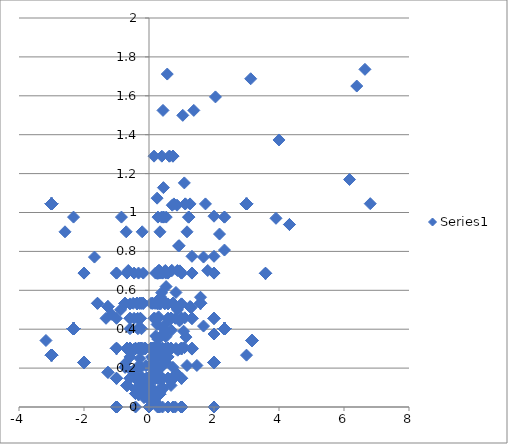
| Category | Series 0 |
|---|---|
| 6.807354922057604 | 1.045 |
| 6.643856189774725 | 1.736 |
| 6.39231742277876 | 1.65 |
| 6.169925001442312 | 1.17 |
| 4.321928094887363 | 0.938 |
| 4.321928094887363 | 0.938 |
| 4.0 | 1.373 |
| 3.9068905956085187 | 0.97 |
| 3.5849625007211565 | 0.687 |
| 3.5849625007211565 | 0.687 |
| 3.5849625007211565 | 0.687 |
| 3.5849625007211565 | 0.687 |
| 3.1699250014423126 | 0.342 |
| 3.1699250014423126 | 0.342 |
| 3.1699250014423126 | 0.342 |
| 3.1699250014423126 | 0.342 |
| 3.1699250014423126 | 0.342 |
| 3.129283016944967 | 1.688 |
| 3.0 | 0.267 |
| 3.0 | 1.044 |
| 3.0 | 1.044 |
| 3.0 | 1.044 |
| 3.0 | 1.044 |
| 3.0 | 1.044 |
| 3.0 | 1.044 |
| 3.0 | 1.044 |
| 3.0 | 1.044 |
| 3.0 | 1.044 |
| 3.0 | 1.044 |
| 3.0 | 1.044 |
| 3.0 | 1.044 |
| 3.0 | 1.044 |
| 2.321928094887362 | 0.402 |
| 2.321928094887362 | 0.402 |
| 2.321928094887362 | 0.402 |
| 2.321928094887362 | 0.402 |
| 2.321928094887362 | 0.402 |
| 2.321928094887362 | 0.402 |
| 2.321928094887362 | 0.402 |
| 2.321928094887362 | 0.402 |
| 2.321928094887362 | 0.402 |
| 2.321928094887362 | 0.402 |
| 2.321928094887362 | 0.402 |
| 2.321928094887362 | 0.402 |
| 2.321928094887362 | 0.402 |
| 2.321928094887362 | 0.402 |
| 2.321928094887362 | 0.402 |
| 2.321928094887362 | 0.402 |
| 2.321928094887362 | 0.402 |
| 2.321928094887362 | 0.402 |
| 2.321928094887362 | 0.402 |
| 2.321928094887362 | 0.402 |
| 2.321928094887362 | 0.402 |
| 2.321928094887362 | 0.402 |
| 2.321928094887362 | 0.402 |
| 2.321928094887362 | 0.402 |
| 2.321928094887362 | 0.402 |
| 2.321928094887362 | 0.402 |
| 2.321928094887362 | 0.402 |
| 2.321928094887362 | 0.402 |
| 2.321928094887362 | 0.402 |
| 2.321928094887362 | 0.402 |
| 2.321928094887362 | 0.402 |
| 2.321928094887362 | 0.402 |
| 2.321928094887362 | 0.402 |
| 2.321928094887362 | 0.402 |
| 2.321928094887362 | 0.402 |
| 2.321928094887362 | 0.402 |
| 2.321928094887362 | 0.402 |
| 2.321928094887362 | 0.402 |
| 2.321928094887362 | 0.402 |
| 2.321928094887362 | 0.402 |
| 2.321928094887362 | 0.402 |
| 2.321928094887362 | 0.402 |
| 2.321928094887362 | 0.402 |
| 2.321928094887362 | 0.402 |
| 2.321928094887362 | 0.402 |
| 2.321928094887362 | 0.402 |
| 2.321928094887362 | 0.402 |
| 2.321928094887362 | 0.402 |
| 2.321928094887362 | 0.402 |
| 2.321928094887362 | 0.402 |
| 2.321928094887362 | 0.402 |
| 2.321928094887362 | 0.402 |
| 2.321928094887362 | 0.402 |
| 2.321928094887362 | 0.402 |
| 2.321928094887362 | 0.807 |
| 2.321928094887362 | 0.976 |
| 2.321928094887362 | 0.976 |
| 2.1699250014423126 | 0.889 |
| 2.0443941193584534 | 1.594 |
| 2.0 | 0.23 |
| 2.0 | 0.23 |
| 2.0 | 0.23 |
| 2.0 | 0.23 |
| 2.0 | 0.23 |
| 2.0 | 0.23 |
| 2.0 | 0.23 |
| 2.0 | 0.23 |
| 2.0 | 0.23 |
| 2.0 | 0.23 |
| 2.0 | 0.23 |
| 2.0 | 0.23 |
| 2.0 | 0.23 |
| 2.0 | 0.23 |
| 2.0 | 0.23 |
| 2.0 | 0.23 |
| 2.0 | 0.23 |
| 2.0 | 0.23 |
| 2.0 | 0.23 |
| 2.0 | 0.23 |
| 2.0 | 0.23 |
| 2.0 | 0.23 |
| 2.0 | 0.23 |
| 2.0 | 0.23 |
| 2.0 | 0.23 |
| 2.0 | 0.23 |
| 2.0 | 0.23 |
| 2.0 | 0.23 |
| 2.0 | 0.23 |
| 2.0 | 0.23 |
| 2.0 | 0.23 |
| 2.0 | 0.23 |
| 2.0 | 0.23 |
| 2.0 | 0.23 |
| 2.0 | 0.23 |
| 2.0 | 0.23 |
| 2.0 | 0.23 |
| 2.0 | 0.23 |
| 2.0 | 0.23 |
| 2.0 | 0.23 |
| 2.0 | 0.23 |
| 2.0 | 0.23 |
| 2.0 | 0.23 |
| 2.0 | 0.23 |
| 2.0 | 0.23 |
| 2.0 | 0.23 |
| 2.0 | 0.23 |
| 2.0 | 0.23 |
| 2.0 | 0.23 |
| 2.0 | 0.23 |
| 2.0 | 0.23 |
| 2.0 | 0.23 |
| 2.0 | 0.23 |
| 2.0 | 0.23 |
| 2.0 | 0.23 |
| 2.0 | 0.23 |
| 2.0 | 0.23 |
| 2.0 | 0.375 |
| 2.0 | 0.456 |
| 2.0 | 0.456 |
| 2.0 | 0.456 |
| 2.0 | 0.456 |
| 2.0 | 0.689 |
| 2.0 | 0.689 |
| 2.0 | 0.775 |
| 2.0 | 0.981 |
| 2.0 | 0 |
| 1.8073549220576042 | 0.702 |
| 1.7369655941662063 | 1.044 |
| 1.6780719051126378 | 0.416 |
| 1.6780719051126378 | 0.771 |
| 1.5849625007211563 | 0.533 |
| 1.5849625007211563 | 0.533 |
| 1.5849625007211563 | 0.533 |
| 1.5849625007211563 | 0.533 |
| 1.5849625007211563 | 0.533 |
| 1.5849625007211563 | 0.533 |
| 1.5849625007211563 | 0.564 |
| 1.4739311883324122 | 0.214 |
| 1.3785116232537298 | 1.525 |
| 1.3219280948873624 | 0.298 |
| 1.3219280948873624 | 0.301 |
| 1.3219280948873624 | 0.301 |
| 1.3219280948873624 | 0.301 |
| 1.3219280948873624 | 0.456 |
| 1.3219280948873624 | 0.456 |
| 1.3219280948873624 | 0.456 |
| 1.3219280948873624 | 0.456 |
| 1.3219280948873624 | 0.689 |
| 1.3219280948873624 | 0.689 |
| 1.3219280948873624 | 0.775 |
| 1.299560281858908 | 0.511 |
| 1.2630344058337937 | 0.515 |
| 1.2630344058337937 | 0.515 |
| 1.2630344058337937 | 0.515 |
| 1.2630344058337937 | 1.044 |
| 1.222392421336448 | 0.976 |
| 1.222392421336448 | 0.976 |
| 1.222392421336448 | 0.976 |
| 1.1699250014423124 | 0.213 |
| 1.1699250014423124 | 0.901 |
| 1.1375035237499351 | 0.359 |
| 1.1154772174199359 | 1.044 |
| 1.1154772174199359 | 1.044 |
| 1.0995356735509143 | 0.459 |
| 1.0874628412503395 | 0.305 |
| 1.0874628412503395 | 1.152 |
| 1.0641303374197155 | 0.39 |
| 1.0395283641866373 | 1.5 |
| 1.0 | 0.148 |
| 1.0 | 0.148 |
| 1.0 | 0.148 |
| 1.0 | 0.301 |
| 1.0 | 0.301 |
| 1.0 | 0.301 |
| 1.0 | 0.301 |
| 1.0 | 0.301 |
| 1.0 | 0.301 |
| 1.0 | 0.301 |
| 1.0 | 0.301 |
| 1.0 | 0.301 |
| 1.0 | 0.301 |
| 1.0 | 0.301 |
| 1.0 | 0.301 |
| 1.0 | 0.301 |
| 1.0 | 0.301 |
| 1.0 | 0.301 |
| 1.0 | 0.301 |
| 1.0 | 0.301 |
| 1.0 | 0.301 |
| 1.0 | 0.301 |
| 1.0 | 0.301 |
| 1.0 | 0.301 |
| 1.0 | 0.301 |
| 1.0 | 0.301 |
| 1.0 | 0.301 |
| 1.0 | 0.301 |
| 1.0 | 0.301 |
| 1.0 | 0.301 |
| 1.0 | 0.301 |
| 1.0 | 0.301 |
| 1.0 | 0.301 |
| 1.0 | 0.301 |
| 1.0 | 0.301 |
| 1.0 | 0.301 |
| 1.0 | 0.301 |
| 1.0 | 0.301 |
| 1.0 | 0.301 |
| 1.0 | 0.301 |
| 1.0 | 0.301 |
| 1.0 | 0.301 |
| 1.0 | 0.301 |
| 1.0 | 0.301 |
| 1.0 | 0.301 |
| 1.0 | 0.301 |
| 1.0 | 0.301 |
| 1.0 | 0.301 |
| 1.0 | 0.456 |
| 1.0 | 0.456 |
| 1.0 | 0.456 |
| 1.0 | 0.456 |
| 1.0 | 0.53 |
| 1.0 | 0.53 |
| 1.0 | 0.689 |
| 1.0 | 0.689 |
| 1.0 | 0 |
| 1.0 | 0 |
| 1.0 | 0 |
| 1.0 | 0 |
| 1.0 | 0 |
| 1.0 | 0 |
| 1.0 | 0 |
| 0.9475325801058645 | 0.7 |
| 0.9385994553358568 | 0.443 |
| 0.925999418556223 | 0.83 |
| 0.9125371587496607 | 0.828 |
| 0.8845227825800641 | 0.292 |
| 0.874469117916141 | 0.5 |
| 0.874469117916141 | 0.702 |
| 0.8624964762500651 | 1.038 |
| 0.8479969065549501 | 0.172 |
| 0.8479969065549501 | 0.172 |
| 0.8300749985576876 | 0.301 |
| 0.8300749985576876 | 0.589 |
| 0.8073549220576041 | 0.456 |
| 0.8073549220576041 | 0 |
| 0.765534746362977 | 1.044 |
| 0.7369655941662062 | 0.204 |
| 0.7369655941662062 | 0.53 |
| 0.7369655941662062 | 0.533 |
| 0.7369655941662062 | 0.533 |
| 0.7369655941662062 | 0.533 |
| 0.7369655941662062 | 0.533 |
| 0.7369655941662062 | 0.533 |
| 0.7369655941662062 | 0.533 |
| 0.7369655941662062 | 0.533 |
| 0.7369655941662062 | 0.533 |
| 0.7369655941662062 | 0.533 |
| 0.7369655941662062 | 1.29 |
| 0.7369655941662062 | 1.29 |
| 0.7369655941662062 | 0 |
| 0.7162070339994088 | 1.038 |
| 0.7004397181410922 | 0.138 |
| 0.7004397181410922 | 0.702 |
| 0.7004397181410922 | 0.702 |
| 0.6896598793878495 | 0.394 |
| 0.6780719051126378 | 0.111 |
| 0.6780719051126378 | 0.301 |
| 0.6780719051126378 | 0.301 |
| 0.6780719051126378 | 0.301 |
| 0.6780719051126378 | 0.301 |
| 0.6780719051126378 | 0.301 |
| 0.6780719051126378 | 0.301 |
| 0.6780719051126378 | 0.301 |
| 0.6780719051126378 | 0.301 |
| 0.6780719051126378 | 0.301 |
| 0.6780719051126378 | 0.301 |
| 0.6780719051126378 | 0.301 |
| 0.6780719051126378 | 0.301 |
| 0.6780719051126378 | 0.301 |
| 0.6780719051126378 | 0.301 |
| 0.6780719051126378 | 0.301 |
| 0.6780719051126378 | 0.301 |
| 0.6780719051126378 | 0.301 |
| 0.6780719051126378 | 0.301 |
| 0.6780719051126378 | 0.301 |
| 0.6780719051126378 | 0.301 |
| 0.6780719051126378 | 0.301 |
| 0.6780719051126378 | 0.301 |
| 0.6780719051126378 | 0.301 |
| 0.6780719051126378 | 0.301 |
| 0.6780719051126378 | 0.456 |
| 0.6780719051126378 | 0.456 |
| 0.6780719051126378 | 0.456 |
| 0.6780719051126378 | 0.456 |
| 0.6280312226130421 | 1.29 |
| 0.6280312226130421 | 1.29 |
| 0.5849625007211562 | 0.148 |
| 0.5849625007211562 | 0.148 |
| 0.5849625007211562 | 0.148 |
| 0.5849625007211562 | 0.257 |
| 0.5849625007211562 | 0.257 |
| 0.5849625007211562 | 0.301 |
| 0.5849625007211562 | 0.301 |
| 0.5849625007211562 | 0.301 |
| 0.5849625007211562 | 0.301 |
| 0.5849625007211562 | 0.301 |
| 0.5849625007211562 | 0.301 |
| 0.5849625007211562 | 0.301 |
| 0.5849625007211562 | 0.301 |
| 0.5849625007211562 | 0.301 |
| 0.5849625007211562 | 0.301 |
| 0.5849625007211562 | 0.301 |
| 0.5849625007211562 | 0.301 |
| 0.5849625007211562 | 0.301 |
| 0.5849625007211562 | 0.301 |
| 0.5849625007211562 | 0.301 |
| 0.5849625007211562 | 0.301 |
| 0.5849625007211562 | 0.301 |
| 0.5849625007211562 | 0.301 |
| 0.5849625007211562 | 0.301 |
| 0.5849625007211562 | 0.301 |
| 0.5849625007211562 | 0.301 |
| 0.5849625007211562 | 0.301 |
| 0.5849625007211562 | 0.301 |
| 0.5849625007211562 | 0.301 |
| 0.5849625007211562 | 0.301 |
| 0.5849625007211562 | 0.301 |
| 0.5849625007211562 | 0.301 |
| 0.5849625007211562 | 0.301 |
| 0.5849625007211562 | 0.301 |
| 0.5849625007211562 | 0.301 |
| 0.5849625007211562 | 0.301 |
| 0.5849625007211562 | 0.301 |
| 0.5849625007211562 | 0.456 |
| 0.5849625007211562 | 0.456 |
| 0.5849625007211562 | 0.53 |
| 0.5849625007211562 | 0.689 |
| 0.5849625007211562 | 0.689 |
| 0.5849625007211562 | 0 |
| 0.5849625007211562 | 0 |
| 0.5849625007211562 | 0 |
| 0.5849625007211562 | 0 |
| 0.5849625007211562 | 0 |
| 0.561878887608115 | 1.712 |
| 0.5305147166987798 | 0.976 |
| 0.5260688116675877 | 0.619 |
| 0.5193741590935794 | 0.361 |
| 0.5145731728297582 | 0.23 |
| 0.5145731728297582 | 0.298 |
| 0.5145731728297582 | 0.298 |
| 0.5145731728297582 | 0.301 |
| 0.5145731728297582 | 0.689 |
| 0.5025003405291834 | 0.702 |
| 0.49749965947081687 | 0.424 |
| 0.4854268271702417 | 0.533 |
| 0.4854268271702417 | 0.533 |
| 0.4854268271702417 | 0.533 |
| 0.4854268271702417 | 0.533 |
| 0.4854268271702417 | 0.533 |
| 0.4854268271702417 | 0.533 |
| 0.4854268271702417 | 0.533 |
| 0.46566357234881184 | 0.695 |
| 0.45943161863729726 | 0.298 |
| 0.44745897697122117 | 0.245 |
| 0.44745897697122117 | 0.402 |
| 0.44745897697122117 | 0.976 |
| 0.44745897697122117 | 0.976 |
| 0.44294349584872833 | 1.128 |
| 0.4405725913859815 | 0.375 |
| 0.4405725913859815 | 0.375 |
| 0.43063435432986236 | 1.525 |
| 0.4150374992788437 | 0.091 |
| 0.4150374992788437 | 0.1 |
| 0.4150374992788437 | 0.1 |
| 0.4150374992788437 | 0.1 |
| 0.4150374992788437 | 0.1 |
| 0.4150374992788437 | 0.148 |
| 0.4150374992788437 | 0.148 |
| 0.4150374992788437 | 0.148 |
| 0.4150374992788437 | 0.257 |
| 0.4150374992788437 | 0.257 |
| 0.4150374992788437 | 0.301 |
| 0.4150374992788437 | 0.301 |
| 0.4150374992788437 | 0.301 |
| 0.4150374992788437 | 0.301 |
| 0.4150374992788437 | 0.301 |
| 0.4150374992788437 | 0.301 |
| 0.4150374992788437 | 0.301 |
| 0.4150374992788437 | 0.301 |
| 0.4150374992788437 | 0.301 |
| 0.4150374992788437 | 0.301 |
| 0.4150374992788437 | 0.301 |
| 0.4150374992788437 | 0.301 |
| 0.4150374992788437 | 0.301 |
| 0.4150374992788437 | 0.301 |
| 0.4150374992788437 | 0.301 |
| 0.4150374992788437 | 0.689 |
| 0.4150374992788437 | 0.689 |
| 0.4150374992788437 | 0 |
| 0.3959286763311393 | 1.29 |
| 0.3870231231092473 | 0.587 |
| 0.3870231231092473 | 0.976 |
| 0.3625700793847084 | 0.204 |
| 0.3625700793847084 | 0.204 |
| 0.3625700793847084 | 0.204 |
| 0.3625700793847084 | 0.204 |
| 0.3625700793847084 | 0.204 |
| 0.3625700793847084 | 0.204 |
| 0.3625700793847084 | 0.204 |
| 0.3625700793847084 | 0.204 |
| 0.3625700793847084 | 0.204 |
| 0.3625700793847084 | 0.204 |
| 0.3625700793847084 | 0.204 |
| 0.3625700793847084 | 0.204 |
| 0.3625700793847084 | 0.204 |
| 0.3625700793847084 | 0.533 |
| 0.3625700793847084 | 0.533 |
| 0.3625700793847084 | 0.533 |
| 0.3625700793847084 | 0.533 |
| 0.3625700793847084 | 0.564 |
| 0.3479233034203068 | 0.689 |
| 0.33703498727757064 | 0.901 |
| 0.32192809488736235 | 0.065 |
| 0.32192809488736235 | 0.065 |
| 0.32192809488736235 | 0.065 |
| 0.32192809488736235 | 0.065 |
| 0.32192809488736235 | 0.065 |
| 0.32192809488736235 | 0.065 |
| 0.32192809488736235 | 0.065 |
| 0.32192809488736235 | 0.065 |
| 0.32192809488736235 | 0.065 |
| 0.32192809488736235 | 0.065 |
| 0.32192809488736235 | 0.065 |
| 0.32192809488736235 | 0.065 |
| 0.32192809488736235 | 0.065 |
| 0.32192809488736235 | 0.065 |
| 0.32192809488736235 | 0.065 |
| 0.32192809488736235 | 0.065 |
| 0.32192809488736235 | 0.065 |
| 0.32192809488736235 | 0.073 |
| 0.32192809488736235 | 0.073 |
| 0.32192809488736235 | 0.073 |
| 0.32192809488736235 | 0.091 |
| 0.32192809488736235 | 0.148 |
| 0.32192809488736235 | 0.148 |
| 0.32192809488736235 | 0.301 |
| 0.32192809488736235 | 0.301 |
| 0.32192809488736235 | 0.301 |
| 0.32192809488736235 | 0.301 |
| 0.32192809488736235 | 0.301 |
| 0.32192809488736235 | 0.301 |
| 0.32192809488736235 | 0.301 |
| 0.32192809488736235 | 0.301 |
| 0.32192809488736235 | 0.53 |
| 0.32192809488736235 | 0.702 |
| 0.32192809488736235 | 0 |
| 0.32192809488736235 | 0 |
| 0.30485458152842093 | 0.351 |
| 0.30485458152842093 | 0.692 |
| 0.29956028185890793 | 0.689 |
| 0.2954558835261713 | 0.463 |
| 0.2954558835261713 | 0.702 |
| 0.28950661719498505 | 0.204 |
| 0.28950661719498505 | 0.204 |
| 0.28950661719498505 | 0.204 |
| 0.28950661719498505 | 0.204 |
| 0.28950661719498505 | 0 |
| 0.2801079191927352 | 0.456 |
| 0.27563444261342734 | 0.976 |
| 0.2700891633677442 | 0.349 |
| 0.2630344058337938 | 0.148 |
| 0.2630344058337938 | 0.148 |
| 0.2630344058337938 | 0.257 |
| 0.2630344058337938 | 0.257 |
| 0.2630344058337938 | 0.257 |
| 0.2630344058337938 | 0.257 |
| 0.2630344058337938 | 0.257 |
| 0.2630344058337938 | 0.257 |
| 0.2630344058337938 | 0.257 |
| 0.2630344058337938 | 0.301 |
| 0.2630344058337938 | 0.301 |
| 0.2630344058337938 | 0.301 |
| 0.2630344058337938 | 0.301 |
| 0.2630344058337938 | 0.301 |
| 0.2630344058337938 | 0.301 |
| 0.2630344058337938 | 0.301 |
| 0.2630344058337938 | 0.53 |
| 0.2630344058337938 | 0.689 |
| 0.2630344058337938 | 0.689 |
| 0.2630344058337938 | 0.689 |
| 0.2630344058337938 | 0.689 |
| 0.2630344058337938 | 0.689 |
| 0.2630344058337938 | 0.689 |
| 0.2630344058337938 | 0.689 |
| 0.2630344058337938 | 0.689 |
| 0.2630344058337938 | 0.689 |
| 0.2630344058337938 | 0.689 |
| 0.2630344058337938 | 0 |
| 0.24997825300834758 | 0.424 |
| 0.2490275478399146 | 1.074 |
| 0.24100809950379498 | 0.204 |
| 0.22239242133644802 | 0.152 |
| 0.22239242133644802 | 0.301 |
| 0.22239242133644802 | 0.301 |
| 0.22239242133644802 | 0.301 |
| 0.22239242133644802 | 0.301 |
| 0.22239242133644802 | 0.301 |
| 0.22239242133644802 | 0.301 |
| 0.20645087746742624 | 0.365 |
| 0.20645087746742624 | 0.533 |
| 0.20163386116965043 | 0.689 |
| 0.19264507794239583 | 0.058 |
| 0.19264507794239583 | 0.148 |
| 0.19264507794239583 | 0.148 |
| 0.19264507794239583 | 0.148 |
| 0.19264507794239583 | 0.148 |
| 0.19264507794239583 | 0.152 |
| 0.19264507794239583 | 0.183 |
| 0.19264507794239583 | 0.298 |
| 0.19264507794239583 | 0.301 |
| 0.19264507794239583 | 0.301 |
| 0.19264507794239583 | 0.301 |
| 0.19264507794239583 | 0.301 |
| 0.18057224564182084 | 0.204 |
| 0.17687776208407918 | 0.456 |
| 0.17333160288556176 | 0.533 |
| 0.16992500144231237 | 0.03 |
| 0.16992500144231237 | 0.03 |
| 0.16992500144231237 | 0.03 |
| 0.16992500144231237 | 0.257 |
| 0.16992500144231237 | 0.301 |
| 0.16992500144231237 | 0.301 |
| 0.15472259479864203 | 1.29 |
| 0.15200309344505006 | 0.148 |
| 0.15200309344505006 | 0.148 |
| 0.15200309344505006 | 0.301 |
| 0.15200309344505006 | 0.301 |
| 0.15200309344505006 | 0.456 |
| 0.13750352374993502 | 0.204 |
| 0.13750352374993502 | 0.301 |
| 0.13430109171159113 | 0.245 |
| 0.12553088208385882 | 0.301 |
| 0.12553088208385882 | 0.301 |
| 0.12553088208385882 | 0.301 |
| 0.12553088208385882 | 0.301 |
| 0.12199052437861024 | 0.23 |
| 0.11547721741993588 | 0.23 |
| 0.11547721741993588 | 0.257 |
| 0.11547721741993588 | 0.301 |
| 0.11103131238874395 | 0.165 |
| 0.11103131238874395 | 0.533 |
| 0.1069152039165119 | 0.148 |
| 0.1069152039165119 | 0.301 |
| 0.1069152039165119 | 0.533 |
| 0.09310940439148147 | 0.148 |
| 0.0874628412503394 | 0.301 |
| 0.08246216019197297 | 0.098 |
| 0.08246216019197297 | 0.257 |
| 0.08246216019197297 | 0.301 |
| 0.07800251200127317 | 0.204 |
| 0.07214978575583542 | 0.165 |
| 0.06871275008401431 | 0.065 |
| 0.06273575534796275 | 0.533 |
| 0.05444778402237651 | 0.301 |
| 0.05246741989413548 | 0.301 |
| 0.05246741989413548 | 0.301 |
| 0.05062607306996814 | 0.301 |
| 0.04730571477835682 | 0.148 |
| 0.04580368961312475 | 0.1 |
| 0.033947331923337536 | 0.048 |
| 0.014950341465971606 | 0.05 |
| 0.0 | 0 |
| 0.0 | 0 |
| 0.0 | 0 |
| 0.0 | 0 |
| 0.0 | 0 |
| 0.0 | 0 |
| 0.0 | 0 |
| 0.0 | 0 |
| 0.0 | 0 |
| 0.0 | 0 |
| 0.0 | 0 |
| 0.0 | 0 |
| 0.0 | 0 |
| 0.0 | 0 |
| 0.0 | 0 |
| 0.0 | 0 |
| 0.0 | 0 |
| 0.0 | 0 |
| 0.0 | 0 |
| 0.0 | 0 |
| 0.0 | 0 |
| 0.0 | 0 |
| 0.0 | 0 |
| 0.0 | 0 |
| 0.0 | 0 |
| 0.0 | 0 |
| 0.0 | 0 |
| 0.0 | 0 |
| 0.0 | 0 |
| 0.0 | 0 |
| 0.0 | 0 |
| 0.0 | 0 |
| 0.0 | 0 |
| 0.0 | 0 |
| 0.0 | 0 |
| 0.0 | 0 |
| 0.0 | 0 |
| 0.0 | 0 |
| 0.0 | 0 |
| 0.0 | 0 |
| 0.0 | 0 |
| 0.0 | 0 |
| 0.0 | 0 |
| 0.0 | 0 |
| 0.0 | 0 |
| 0.0 | 0 |
| 0.0 | 0 |
| 0.0 | 0 |
| 0.0 | 0 |
| 0.0 | 0 |
| 0.0 | 0 |
| 0.0 | 0 |
| 0.0 | 0 |
| 0.0 | 0 |
| 0.0 | 0 |
| 0.0 | 0 |
| 0.0 | 0 |
| 0.0 | 0 |
| 0.0 | 0 |
| 0.0 | 0 |
| 0.0 | 0 |
| 0.0 | 0 |
| 0.0 | 0 |
| 0.0 | 0 |
| 0.0 | 0 |
| 0.0 | 0 |
| 0.0 | 0 |
| 0.0 | 0 |
| 0.0 | 0 |
| 0.0 | 0 |
| 0.0 | 0 |
| 0.0 | 0 |
| 0.0 | 0 |
| 0.0 | 0 |
| 0.0 | 0 |
| 0.0 | 0 |
| 0.0 | 0 |
| 0.0 | 0 |
| 0.0 | 0 |
| 0.0 | 0 |
| 0.0 | 0 |
| 0.0 | 0 |
| 0.0 | 0 |
| 0.0 | 0 |
| 0.0 | 0 |
| 0.0 | 0 |
| 0.0 | 0 |
| 0.0 | 0 |
| 0.0 | 0 |
| 0.0 | 0 |
| 0.0 | 0 |
| 0.0 | 0 |
| 0.0 | 0 |
| 0.0 | 0 |
| 0.0 | 0 |
| 0.0 | 0 |
| 0.0 | 0 |
| 0.0 | 0 |
| 0.0 | 0 |
| 0.0 | 0 |
| 0.0 | 0 |
| 0.0 | 0 |
| 0.0 | 0 |
| 0.0 | 0 |
| 0.0 | 0 |
| 0.0 | 0 |
| 0.0 | 0 |
| 0.0 | 0 |
| 0.0 | 0 |
| 0.0 | 0 |
| 0.0 | 0 |
| 0.0 | 0 |
| 0.0 | 0 |
| 0.0 | 0 |
| 0.0 | 0 |
| 0.0 | 0 |
| 0.0 | 0 |
| 0.0 | 0 |
| 0.0 | 0 |
| 0.0 | 0 |
| 0.0 | 0 |
| 0.0 | 0 |
| 0.0 | 0 |
| 0.0 | 0 |
| 0.0 | 0 |
| 0.0 | 0 |
| 0.0 | 0 |
| 0.0 | 0 |
| 0.0 | 0 |
| 0.0 | 0 |
| 0.0 | 0 |
| 0.0 | 0 |
| 0.0 | 0 |
| 0.0 | 0 |
| 0.0 | 0 |
| 0.0 | 0 |
| 0.0 | 0 |
| 0.0 | 0 |
| 0.0 | 0 |
| 0.0 | 0 |
| 0.0 | 0 |
| 0.0 | 0 |
| 0.0 | 0 |
| 0.0 | 0 |
| 0.0 | 0 |
| 0.0 | 0 |
| 0.0 | 0 |
| 0.0 | 0 |
| 0.0 | 0 |
| 0.0 | 0 |
| 0.0 | 0 |
| 0.0 | 0 |
| 0.0 | 0 |
| 0.0 | 0 |
| 0.0 | 0 |
| 0.0 | 0 |
| 0.0 | 0 |
| 0.0 | 0 |
| 0.0 | 0 |
| 0.0 | 0 |
| 0.0 | 0 |
| 0.0 | 0 |
| 0.0 | 0 |
| 0.0 | 0 |
| 0.0 | 0 |
| 0.0 | 0 |
| 0.0 | 0 |
| 0.0 | 0 |
| 0.0 | 0 |
| 0.0 | 0 |
| 0.0 | 0 |
| 0.0 | 0 |
| 0.0 | 0 |
| 0.0 | 0 |
| 0.0 | 0 |
| 0.0 | 0 |
| 0.0 | 0 |
| 0.0 | 0 |
| 0.0 | 0 |
| 0.0 | 0 |
| 0.0 | 0 |
| 0.0 | 0 |
| 0.0 | 0 |
| 0.0 | 0 |
| 0.0 | 0 |
| 0.0 | 0 |
| 0.0 | 0 |
| 0.0 | 0 |
| 0.0 | 0 |
| 0.0 | 0 |
| 0.0 | 0 |
| 0.0 | 0 |
| 0.0 | 0 |
| 0.0 | 0 |
| 0.0 | 0 |
| 0.0 | 0 |
| 0.0 | 0 |
| 0.0 | 0 |
| 0.0 | 0 |
| 0.0 | 0 |
| 0.0 | 0 |
| 0.0 | 0 |
| 0.0 | 0 |
| 0.0 | 0 |
| 0.0 | 0 |
| 0.0 | 0 |
| 0.0 | 0 |
| 0.0 | 0 |
| 0.0 | 0 |
| 0.0 | 0 |
| 0.0 | 0 |
| 0.0 | 0 |
| 0.0 | 0 |
| 0.0 | 0 |
| 0.0 | 0 |
| 0.0 | 0 |
| 0.0 | 0 |
| 0.0 | 0 |
| 0.0 | 0 |
| 0.0 | 0 |
| 0.0 | 0 |
| 0.0 | 0 |
| 0.0 | 0 |
| 0.0 | 0 |
| 0.0 | 0 |
| 0.0 | 0 |
| 0.0 | 0 |
| 0.0 | 0 |
| 0.0 | 0 |
| 0.0 | 0 |
| 0.0 | 0 |
| 0.0 | 0 |
| 0.0 | 0 |
| 0.0 | 0 |
| 0.0 | 0 |
| 0.0 | 0 |
| 0.0 | 0 |
| 0.0 | 0 |
| 0.0 | 0 |
| 0.0 | 0 |
| 0.0 | 0 |
| 0.0 | 0 |
| 0.0 | 0 |
| 0.0 | 0 |
| 0.0 | 0 |
| 0.0 | 0 |
| 0.0 | 0 |
| 0.0 | 0 |
| 0.0 | 0 |
| 0.0 | 0 |
| 0.0 | 0 |
| 0.0 | 0 |
| 0.0 | 0 |
| 0.0 | 0 |
| 0.0 | 0 |
| 0.0 | 0 |
| 0.0 | 0 |
| 0.0 | 0 |
| 0.0 | 0 |
| 0.0 | 0 |
| 0.0 | 0 |
| 0.0 | 0 |
| 0.0 | 0 |
| 0.0 | 0 |
| 0.0 | 0 |
| 0.0 | 0 |
| 0.0 | 0 |
| 0.0 | 0 |
| 0.0 | 0 |
| 0.0 | 0 |
| 0.0 | 0 |
| 0.0 | 0 |
| 0.0 | 0 |
| 0.0 | 0 |
| 0.0 | 0 |
| 0.0 | 0 |
| 0.0 | 0 |
| 0.0 | 0 |
| 0.0 | 0 |
| 0.0 | 0 |
| 0.0 | 0 |
| 0.0 | 0 |
| 0.0 | 0 |
| 0.0 | 0 |
| 0.0 | 0 |
| 0.0 | 0 |
| 0.0 | 0 |
| 0.0 | 0 |
| 0.0 | 0 |
| 0.0 | 0 |
| 0.0 | 0 |
| 0.0 | 0 |
| 0.0 | 0 |
| 0.0 | 0 |
| 0.0 | 0 |
| 0.0 | 0 |
| 0.0 | 0 |
| 0.0 | 0 |
| 0.0 | 0 |
| 0.0 | 0 |
| 0.0 | 0 |
| 0.0 | 0 |
| 0.0 | 0 |
| 0.0 | 0 |
| 0.0 | 0 |
| 0.0 | 0 |
| 0.0 | 0 |
| 0.0 | 0 |
| 0.0 | 0 |
| 0.0 | 0 |
| 0.0 | 0 |
| 0.0 | 0 |
| 0.0 | 0 |
| 0.0 | 0 |
| 0.0 | 0 |
| 0.0 | 0 |
| 0.0 | 0 |
| 0.0 | 0 |
| 0.0 | 0 |
| 0.0 | 0 |
| 0.0 | 0 |
| 0.0 | 0 |
| 0.0 | 0 |
| 0.0 | 0 |
| 0.0 | 0 |
| 0.0 | 0 |
| 0.0 | 0 |
| 0.0 | 0 |
| 0.0 | 0 |
| 0.0 | 0 |
| 0.0 | 0 |
| 0.0 | 0 |
| 0.0 | 0 |
| 0.0 | 0 |
| 0.0 | 0 |
| 0.0 | 0 |
| 0.0 | 0 |
| 0.0 | 0 |
| 0.0 | 0 |
| 0.0 | 0 |
| 0.0 | 0 |
| 0.0 | 0 |
| 0.0 | 0 |
| 0.0 | 0 |
| 0.0 | 0 |
| 0.0 | 0 |
| 0.0 | 0 |
| 0.0 | 0 |
| 0.0 | 0 |
| 0.0 | 0 |
| 0.0 | 0 |
| 0.0 | 0 |
| 0.0 | 0 |
| 0.0 | 0 |
| 0.0 | 0 |
| 0.0 | 0 |
| 0.0 | 0 |
| 0.0 | 0 |
| 0.0 | 0 |
| 0.0 | 0 |
| 0.0 | 0 |
| 0.0 | 0 |
| 0.0 | 0 |
| 0.0 | 0 |
| 0.0 | 0 |
| 0.0 | 0 |
| 0.0 | 0 |
| 0.0 | 0 |
| 0.0 | 0 |
| 0.0 | 0 |
| 0.0 | 0 |
| 0.0 | 0 |
| 0.0 | 0 |
| 0.0 | 0 |
| 0.0 | 0 |
| 0.0 | 0 |
| 0.0 | 0 |
| 0.0 | 0 |
| 0.0 | 0 |
| 0.0 | 0 |
| 0.0 | 0 |
| 0.0 | 0 |
| 0.0 | 0 |
| 0.0 | 0 |
| 0.0 | 0 |
| 0.0 | 0 |
| 0.0 | 0 |
| 0.0 | 0 |
| 0.0 | 0 |
| 0.0 | 0 |
| 0.0 | 0 |
| 0.0 | 0 |
| 0.0 | 0 |
| 0.0 | 0 |
| 0.0 | 0 |
| 0.0 | 0 |
| 0.0 | 0 |
| 0.0 | 0 |
| 0.0 | 0 |
| 0.0 | 0 |
| 0.0 | 0 |
| 0.0 | 0 |
| 0.0 | 0 |
| 0.0 | 0 |
| 0.0 | 0 |
| 0.0 | 0 |
| 0.0 | 0 |
| 0.0 | 0 |
| 0.0 | 0 |
| 0.0 | 0 |
| 0.0 | 0 |
| 0.0 | 0 |
| 0.0 | 0 |
| 0.0 | 0 |
| 0.0 | 0 |
| 0.0 | 0 |
| 0.0 | 0 |
| 0.0 | 0 |
| 0.0 | 0 |
| 0.0 | 0 |
| 0.0 | 0 |
| 0.0 | 0 |
| 0.0 | 0 |
| 0.0 | 0 |
| 0.0 | 0 |
| 0.0 | 0 |
| 0.0 | 0 |
| 0.0 | 0 |
| 0.0 | 0 |
| 0.0 | 0 |
| 0.0 | 0 |
| 0.0 | 0 |
| 0.0 | 0 |
| 0.0 | 0 |
| 0.0 | 0 |
| 0.0 | 0 |
| 0.0 | 0 |
| 0.0 | 0 |
| 0.0 | 0 |
| 0.0 | 0 |
| 0.0 | 0 |
| 0.0 | 0 |
| 0.0 | 0 |
| 0.0 | 0 |
| 0.0 | 0 |
| 0.0 | 0 |
| 0.0 | 0 |
| 0.0 | 0 |
| 0.0 | 0 |
| 0.0 | 0 |
| 0.0 | 0 |
| 0.0 | 0 |
| 0.0 | 0 |
| 0.0 | 0 |
| 0.0 | 0 |
| 0.0 | 0 |
| 0.0 | 0 |
| 0.0 | 0 |
| 0.0 | 0 |
| 0.0 | 0 |
| 0.0 | 0 |
| 0.0 | 0 |
| 0.0 | 0 |
| 0.0 | 0 |
| 0.0 | 0 |
| 0.0 | 0 |
| 0.0 | 0 |
| 0.0 | 0 |
| 0.0 | 0 |
| 0.0 | 0 |
| 0.0 | 0 |
| 0.0 | 0 |
| 0.0 | 0 |
| 0.0 | 0 |
| -0.019365324866931058 | 0.041 |
| -0.04182017569462706 | 0.148 |
| -0.044394119358453395 | 0.065 |
| -0.0558532347335174 | 0.1 |
| -0.058893689053568565 | 0.071 |
| -0.061400544664143256 | 0.148 |
| -0.061400544664143256 | 0.148 |
| -0.061400544664143256 | 0.148 |
| -0.061400544664143256 | 0.148 |
| -0.06711419585853691 | 0.073 |
| -0.07214978575583542 | 0.12 |
| -0.08746284125033943 | 0.148 |
| -0.08926733809708741 | 0.212 |
| -0.09310940439148148 | 0.129 |
| -0.0995356735509144 | 0.073 |
| -0.10691520391651191 | 0.301 |
| -0.10691520391651191 | 0.301 |
| -0.1154772174199359 | 0.118 |
| -0.12553088208385899 | 0.301 |
| -0.12553088208385899 | 0.301 |
| -0.13750352374993496 | 0.1 |
| -0.15200309344504997 | 0.048 |
| -0.15200309344504997 | 0.073 |
| -0.15200309344504997 | 0.301 |
| -0.17687776208407935 | 0.689 |
| -0.18057224564182092 | 0.533 |
| -0.18057224564182092 | 0.533 |
| -0.18057224564182092 | 0.533 |
| -0.18442457113742744 | 0.298 |
| -0.1926450779423959 | 0.073 |
| -0.1926450779423959 | 0.148 |
| -0.1926450779423959 | 0.148 |
| -0.1926450779423959 | 0.148 |
| -0.2094533656289497 | 0.901 |
| -0.22239242133644802 | 0.148 |
| -0.22239242133644802 | 0.148 |
| -0.22239242133644802 | 0.301 |
| -0.22239242133644802 | 0.301 |
| -0.22239242133644802 | 0.301 |
| -0.22239242133644802 | 0.301 |
| -0.22239242133644802 | 0.301 |
| -0.23132554610645564 | 0.402 |
| -0.24100809950379493 | 0.204 |
| -0.24100809950379493 | 0.533 |
| -0.24100809950379493 | 0.533 |
| -0.2630344058337938 | 0.301 |
| -0.2630344058337938 | 0.301 |
| -0.2630344058337938 | 0.301 |
| -0.2630344058337938 | 0.301 |
| -0.2630344058337938 | 0.301 |
| -0.2630344058337938 | 0.301 |
| -0.2630344058337938 | 0.301 |
| -0.2630344058337938 | 0.301 |
| -0.2630344058337938 | 0.456 |
| -0.2630344058337938 | 0.456 |
| -0.28010791919273537 | 0.129 |
| -0.28010791919273537 | 0.249 |
| -0.2895066171949848 | 0.204 |
| -0.2895066171949848 | 0.533 |
| -0.2895066171949848 | 0.533 |
| -0.3219280948873623 | 0.065 |
| -0.3219280948873623 | 0.065 |
| -0.3219280948873623 | 0.065 |
| -0.3219280948873623 | 0.065 |
| -0.3219280948873623 | 0.065 |
| -0.3219280948873623 | 0.065 |
| -0.3219280948873623 | 0.065 |
| -0.3219280948873623 | 0.065 |
| -0.3219280948873623 | 0.065 |
| -0.3219280948873623 | 0.065 |
| -0.3219280948873623 | 0.065 |
| -0.3219280948873623 | 0.065 |
| -0.3219280948873623 | 0.065 |
| -0.3219280948873623 | 0.065 |
| -0.3219280948873623 | 0.065 |
| -0.3219280948873623 | 0.1 |
| -0.3219280948873623 | 0.148 |
| -0.3219280948873623 | 0.148 |
| -0.3219280948873623 | 0.301 |
| -0.3219280948873623 | 0.301 |
| -0.3219280948873623 | 0.301 |
| -0.3219280948873623 | 0.301 |
| -0.3219280948873623 | 0.301 |
| -0.3219280948873623 | 0.301 |
| -0.3219280948873623 | 0.301 |
| -0.3219280948873623 | 0.301 |
| -0.3219280948873623 | 0.301 |
| -0.3219280948873623 | 0.301 |
| -0.3219280948873623 | 0.301 |
| -0.3219280948873623 | 0.301 |
| -0.3219280948873623 | 0.301 |
| -0.3219280948873623 | 0.301 |
| -0.3219280948873623 | 0.301 |
| -0.3219280948873623 | 0.301 |
| -0.3219280948873623 | 0.301 |
| -0.3219280948873623 | 0.301 |
| -0.3219280948873623 | 0.301 |
| -0.3219280948873623 | 0.301 |
| -0.3219280948873623 | 0.301 |
| -0.3219280948873623 | 0.301 |
| -0.3219280948873623 | 0.301 |
| -0.3219280948873623 | 0.301 |
| -0.3219280948873623 | 0.301 |
| -0.3219280948873623 | 0.301 |
| -0.3219280948873623 | 0.301 |
| -0.3219280948873623 | 0.301 |
| -0.3219280948873623 | 0.301 |
| -0.3219280948873623 | 0.301 |
| -0.3219280948873623 | 0.301 |
| -0.3219280948873623 | 0.301 |
| -0.3219280948873623 | 0.689 |
| -0.34103691783506696 | 0.402 |
| -0.3479233034203069 | 0.456 |
| -0.36257007938470825 | 0.204 |
| -0.36257007938470825 | 0.533 |
| -0.36257007938470825 | 0.533 |
| -0.36257007938470825 | 0.533 |
| -0.36257007938470825 | 0.533 |
| -0.36257007938470825 | 0.533 |
| -0.36257007938470825 | 0.533 |
| -0.36257007938470825 | 0.533 |
| -0.36257007938470825 | 0.533 |
| -0.36257007938470825 | 0.533 |
| -0.36257007938470825 | 0.533 |
| -0.36257007938470825 | 0.533 |
| -0.36257007938470825 | 0.533 |
| -0.36257007938470825 | 0.533 |
| -0.36257007938470825 | 0.533 |
| -0.36257007938470825 | 0.533 |
| -0.36257007938470825 | 0.533 |
| -0.36257007938470825 | 0.533 |
| -0.36257007938470825 | 0.533 |
| -0.36257007938470825 | 0.533 |
| -0.36257007938470825 | 0.533 |
| -0.4150374992788438 | 0.069 |
| -0.4150374992788438 | 0.069 |
| -0.4150374992788438 | 0.091 |
| -0.4150374992788438 | 0.091 |
| -0.4150374992788438 | 0.091 |
| -0.4150374992788438 | 0.148 |
| -0.4150374992788438 | 0.148 |
| -0.4150374992788438 | 0.148 |
| -0.4150374992788438 | 0.148 |
| -0.4150374992788438 | 0.148 |
| -0.4150374992788438 | 0.148 |
| -0.4150374992788438 | 0.148 |
| -0.4150374992788438 | 0.148 |
| -0.4150374992788438 | 0.301 |
| -0.4150374992788438 | 0.301 |
| -0.4150374992788438 | 0.301 |
| -0.4150374992788438 | 0.301 |
| -0.4150374992788438 | 0.301 |
| -0.4150374992788438 | 0.301 |
| -0.4150374992788438 | 0.301 |
| -0.4150374992788438 | 0.301 |
| -0.4150374992788438 | 0.301 |
| -0.4150374992788438 | 0.301 |
| -0.4150374992788438 | 0.301 |
| -0.4150374992788438 | 0 |
| -0.45943161863729726 | 0.298 |
| -0.45943161863729726 | 0.456 |
| -0.45943161863729726 | 0.689 |
| -0.4854268271702417 | 0.533 |
| -0.5145731728297583 | 0.182 |
| -0.5849625007211563 | 0.148 |
| -0.5849625007211563 | 0.148 |
| -0.5849625007211563 | 0.257 |
| -0.5849625007211563 | 0.301 |
| -0.5849625007211563 | 0.301 |
| -0.5849625007211563 | 0.301 |
| -0.5849625007211563 | 0.301 |
| -0.5849625007211563 | 0.301 |
| -0.5849625007211563 | 0.301 |
| -0.5849625007211563 | 0.301 |
| -0.5849625007211563 | 0.301 |
| -0.5849625007211563 | 0.301 |
| -0.5849625007211563 | 0.301 |
| -0.5849625007211563 | 0.301 |
| -0.5849625007211563 | 0.301 |
| -0.5849625007211563 | 0.301 |
| -0.5849625007211563 | 0.301 |
| -0.5849625007211563 | 0.301 |
| -0.5849625007211563 | 0.301 |
| -0.5849625007211563 | 0.301 |
| -0.5849625007211563 | 0.301 |
| -0.5849625007211563 | 0.301 |
| -0.5849625007211563 | 0.301 |
| -0.5849625007211563 | 0.301 |
| -0.5849625007211563 | 0.301 |
| -0.5849625007211563 | 0.301 |
| -0.5849625007211563 | 0.301 |
| -0.5849625007211563 | 0.402 |
| -0.5849625007211563 | 0.456 |
| -0.5849625007211563 | 0.456 |
| -0.5849625007211563 | 0.53 |
| -0.6374299206152917 | 0.702 |
| -0.6780719051126377 | 0.111 |
| -0.6780719051126377 | 0.111 |
| -0.6780719051126377 | 0.111 |
| -0.6780719051126377 | 0.111 |
| -0.6780719051126377 | 0.301 |
| -0.6780719051126377 | 0.301 |
| -0.6780719051126377 | 0.301 |
| -0.6780719051126377 | 0.301 |
| -0.6780719051126377 | 0.301 |
| -0.6780719051126377 | 0.301 |
| -0.6780719051126377 | 0.301 |
| -0.6780719051126377 | 0.301 |
| -0.6780719051126377 | 0.301 |
| -0.6780719051126377 | 0.301 |
| -0.6780719051126377 | 0.301 |
| -0.6780719051126377 | 0.301 |
| -0.6780719051126377 | 0.301 |
| -0.6780719051126377 | 0.301 |
| -0.6780719051126377 | 0.301 |
| -0.6780719051126377 | 0.689 |
| -0.7004397181410922 | 0.901 |
| -0.7198920808072649 | 0.225 |
| -0.7369655941662062 | 0.204 |
| -0.7369655941662062 | 0.204 |
| -0.7369655941662062 | 0.533 |
| -0.7369655941662062 | 0.533 |
| -0.7369655941662062 | 0.533 |
| -0.7369655941662062 | 0.533 |
| -0.7369655941662062 | 0.533 |
| -0.7369655941662062 | 0.533 |
| -0.84799690655495 | 0.976 |
| -0.8744691179161412 | 0.5 |
| -1.0 | 0.148 |
| -1.0 | 0.148 |
| -1.0 | 0.148 |
| -1.0 | 0.301 |
| -1.0 | 0.301 |
| -1.0 | 0.301 |
| -1.0 | 0.301 |
| -1.0 | 0.301 |
| -1.0 | 0.301 |
| -1.0 | 0.301 |
| -1.0 | 0.301 |
| -1.0 | 0.301 |
| -1.0 | 0.301 |
| -1.0 | 0.301 |
| -1.0 | 0.301 |
| -1.0 | 0.301 |
| -1.0 | 0.301 |
| -1.0 | 0.301 |
| -1.0 | 0.301 |
| -1.0 | 0.301 |
| -1.0 | 0.301 |
| -1.0 | 0.456 |
| -1.0 | 0.689 |
| -1.0 | 0.689 |
| -1.0 | 0 |
| -1.0 | 0 |
| -1.0 | 0 |
| -1.0 | 0 |
| -1.0 | 0 |
| -1.0 | 0 |
| -1.0 | 0 |
| -1.0 | 0 |
| -1.0 | 0 |
| -1.0 | 0 |
| -1.0 | 0 |
| -1.15200309344505 | 0.477 |
| -1.2630344058337937 | 0.178 |
| -1.2630344058337937 | 0.178 |
| -1.2630344058337937 | 0.515 |
| -1.2630344058337937 | 0.515 |
| -1.2630344058337937 | 0.515 |
| -1.2630344058337937 | 0.515 |
| -1.2630344058337937 | 0.515 |
| -1.2630344058337937 | 0.515 |
| -1.3219280948873622 | 0.456 |
| -1.5849625007211563 | 0.533 |
| -1.5849625007211563 | 0.533 |
| -1.6780719051126378 | 0.771 |
| -2.0 | 0.23 |
| -2.0 | 0.23 |
| -2.0 | 0.23 |
| -2.0 | 0.23 |
| -2.0 | 0.23 |
| -2.0 | 0.23 |
| -2.0 | 0.23 |
| -2.0 | 0.23 |
| -2.0 | 0.23 |
| -2.0 | 0.23 |
| -2.0 | 0.23 |
| -2.0 | 0.23 |
| -2.0 | 0.23 |
| -2.0 | 0.23 |
| -2.0 | 0.23 |
| -2.0 | 0.23 |
| -2.0 | 0.23 |
| -2.0 | 0.23 |
| -2.0 | 0.23 |
| -2.0 | 0.23 |
| -2.0 | 0.23 |
| -2.0 | 0.23 |
| -2.0 | 0.23 |
| -2.0 | 0.23 |
| -2.0 | 0.23 |
| -2.0 | 0.23 |
| -2.0 | 0.23 |
| -2.0 | 0.23 |
| -2.0 | 0.23 |
| -2.0 | 0.23 |
| -2.0 | 0.23 |
| -2.0 | 0.23 |
| -2.0 | 0.23 |
| -2.0 | 0.23 |
| -2.0 | 0.23 |
| -2.0 | 0.23 |
| -2.0 | 0.23 |
| -2.0 | 0.23 |
| -2.0 | 0.23 |
| -2.0 | 0.23 |
| -2.0 | 0.23 |
| -2.0 | 0.23 |
| -2.0 | 0.23 |
| -2.0 | 0.23 |
| -2.0 | 0.23 |
| -2.0 | 0.23 |
| -2.0 | 0.23 |
| -2.0 | 0.23 |
| -2.0 | 0.23 |
| -2.0 | 0.23 |
| -2.0 | 0.23 |
| -2.0 | 0.23 |
| -2.0 | 0.23 |
| -2.0 | 0.23 |
| -2.0 | 0.23 |
| -2.0 | 0.23 |
| -2.0 | 0.23 |
| -2.0 | 0.23 |
| -2.0 | 0.23 |
| -2.0 | 0.23 |
| -2.0 | 0.23 |
| -2.0 | 0.23 |
| -2.0 | 0.23 |
| -2.0 | 0.23 |
| -2.0 | 0.689 |
| -2.0 | 0.689 |
| -2.321928094887362 | 0.402 |
| -2.321928094887362 | 0.402 |
| -2.321928094887362 | 0.402 |
| -2.321928094887362 | 0.402 |
| -2.321928094887362 | 0.402 |
| -2.321928094887362 | 0.402 |
| -2.321928094887362 | 0.402 |
| -2.321928094887362 | 0.402 |
| -2.321928094887362 | 0.402 |
| -2.321928094887362 | 0.402 |
| -2.321928094887362 | 0.402 |
| -2.321928094887362 | 0.402 |
| -2.321928094887362 | 0.402 |
| -2.321928094887362 | 0.402 |
| -2.321928094887362 | 0.402 |
| -2.321928094887362 | 0.402 |
| -2.321928094887362 | 0.402 |
| -2.321928094887362 | 0.402 |
| -2.321928094887362 | 0.402 |
| -2.321928094887362 | 0.402 |
| -2.321928094887362 | 0.402 |
| -2.321928094887362 | 0.402 |
| -2.321928094887362 | 0.402 |
| -2.321928094887362 | 0.402 |
| -2.321928094887362 | 0.402 |
| -2.321928094887362 | 0.402 |
| -2.321928094887362 | 0.402 |
| -2.321928094887362 | 0.402 |
| -2.321928094887362 | 0.402 |
| -2.321928094887362 | 0.402 |
| -2.321928094887362 | 0.402 |
| -2.321928094887362 | 0.402 |
| -2.321928094887362 | 0.402 |
| -2.321928094887362 | 0.402 |
| -2.321928094887362 | 0.402 |
| -2.321928094887362 | 0.402 |
| -2.321928094887362 | 0.402 |
| -2.321928094887362 | 0.402 |
| -2.321928094887362 | 0.402 |
| -2.321928094887362 | 0.976 |
| -2.584962500721156 | 0.901 |
| -3.0 | 0.267 |
| -3.0 | 0.267 |
| -3.0 | 0.267 |
| -3.0 | 0.267 |
| -3.0 | 0.267 |
| -3.0 | 0.267 |
| -3.0 | 0.267 |
| -3.0 | 0.267 |
| -3.0 | 0.267 |
| -3.0 | 0.267 |
| -3.0 | 0.267 |
| -3.0 | 0.267 |
| -3.0 | 1.044 |
| -3.0 | 1.044 |
| -3.0 | 1.044 |
| -3.0 | 1.044 |
| -3.0 | 1.044 |
| -3.0 | 1.044 |
| -3.0 | 1.044 |
| -3.0 | 1.044 |
| -3.0 | 1.044 |
| -3.0 | 1.044 |
| -3.0 | 1.044 |
| -3.0 | 1.044 |
| -3.0 | 1.044 |
| -3.0 | 1.044 |
| -3.0 | 1.044 |
| -3.0 | 1.044 |
| -3.0 | 1.044 |
| -3.0 | 1.044 |
| -3.0 | 1.044 |
| -3.0 | 1.044 |
| -3.0 | 1.044 |
| -3.0 | 1.044 |
| -3.0 | 1.044 |
| -3.0 | 1.044 |
| -3.0 | 1.044 |
| -3.0 | 1.044 |
| -3.0 | 1.044 |
| -3.0 | 1.044 |
| -3.0 | 1.044 |
| -3.1699250014423126 | 0.342 |